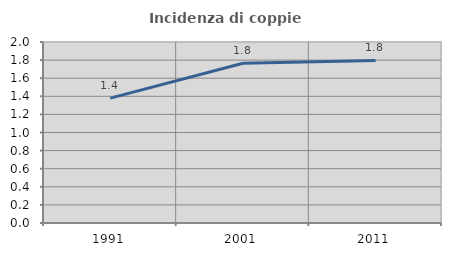
| Category | Incidenza di coppie miste |
|---|---|
| 1991.0 | 1.379 |
| 2001.0 | 1.765 |
| 2011.0 | 1.796 |